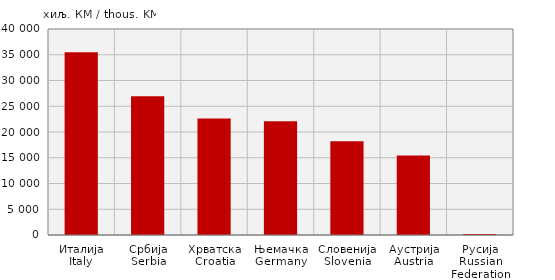
| Category | Извоз
Export |
|---|---|
| Италија
Italy | 35506 |
| Србија
Serbia | 26937 |
| Хрватска
Croatia | 22617 |
| Њемачка
Germany | 22104 |
| Словенија
Slovenia | 18183 |
| Аустрија
Austria | 15429 |
| Русија
Russian Federation | 214 |